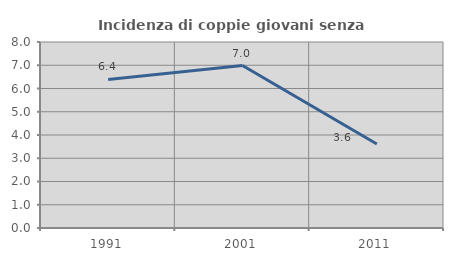
| Category | Incidenza di coppie giovani senza figli |
|---|---|
| 1991.0 | 6.388 |
| 2001.0 | 6.988 |
| 2011.0 | 3.612 |